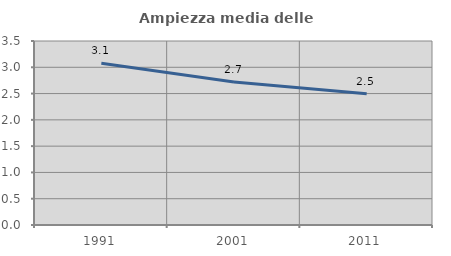
| Category | Ampiezza media delle famiglie |
|---|---|
| 1991.0 | 3.076 |
| 2001.0 | 2.721 |
| 2011.0 | 2.496 |